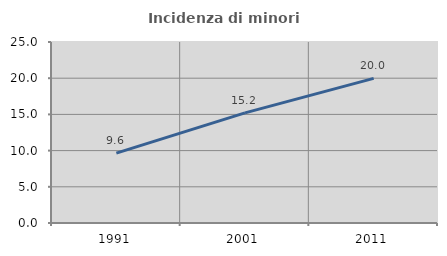
| Category | Incidenza di minori stranieri |
|---|---|
| 1991.0 | 9.644 |
| 2001.0 | 15.212 |
| 2011.0 | 19.98 |